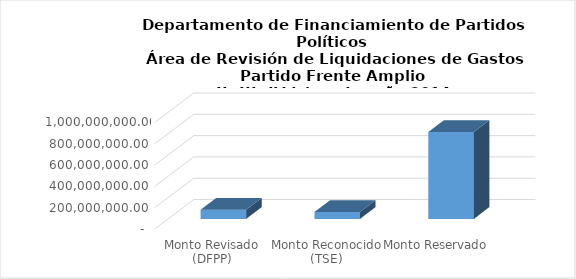
| Category | Series 0 |
|---|---|
| Monto Revisado (DFPP) | 85519580.77 |
| Monto Reconocido (TSE) | 64875856.01 |
| Monto Reservado  | 816417064.34 |